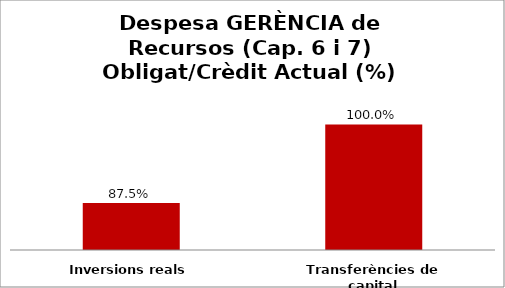
| Category | Series 0 |
|---|---|
| Inversions reals | 0.875 |
| Transferències de capital | 1 |